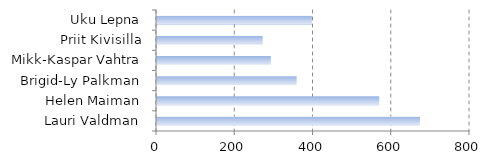
| Category | Series 0 |
|---|---|
| Lauri Valdman | 672 |
| Helen Maiman | 568 |
| Brigid-Ly Palkman | 357 |
| Mikk-Kaspar Vahtra | 291 |
| Priit Kivisilla | 270 |
| Uku Lepna | 396 |